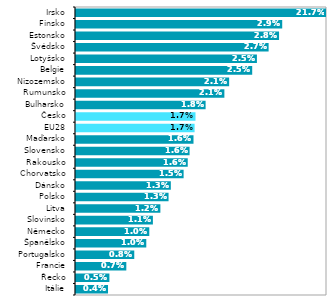
| Category | 2018* |
|---|---|
| Itálie | 0.004 |
| Řecko | 0.005 |
| Francie | 0.007 |
| Portugalsko | 0.008 |
| Španělsko | 0.01 |
| Německo | 0.01 |
| Slovinsko | 0.011 |
| Litva | 0.012 |
| Polsko | 0.013 |
| Dánsko | 0.013 |
| Chorvatsko | 0.015 |
| Rakousko | 0.016 |
| Slovensko | 0.016 |
| Maďarsko | 0.016 |
| EU28 | 0.017 |
| Česko | 0.017 |
| Bulharsko | 0.018 |
| Rumunsko | 0.021 |
| Nizozemsko | 0.021 |
| Belgie | 0.025 |
| Lotyšsko | 0.025 |
| Švédsko | 0.027 |
| Estonsko | 0.028 |
| Finsko | 0.029 |
| Irsko | 0.217 |